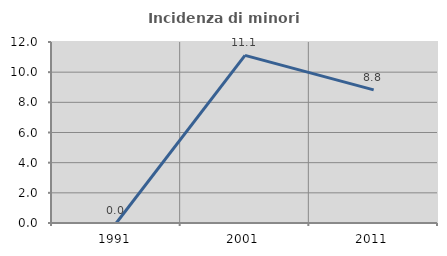
| Category | Incidenza di minori stranieri |
|---|---|
| 1991.0 | 0 |
| 2001.0 | 11.111 |
| 2011.0 | 8.824 |